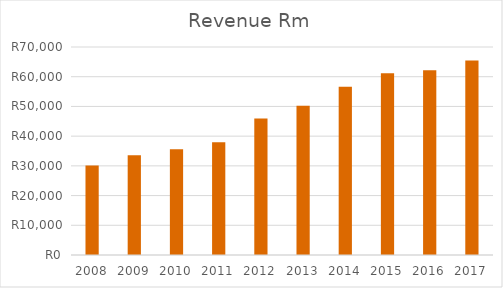
| Category | Revenue |
|---|---|
| 2008.0 | 30091 |
| 2009.0 | 33592 |
| 2010.0 | 35610 |
| 2011.0 | 37952 |
| 2012.0 | 45900 |
| 2013.0 | 50194 |
| 2014.0 | 56606 |
| 2015.0 | 61152 |
| 2016.0 | 62167 |
| 2017.0 | 65478 |